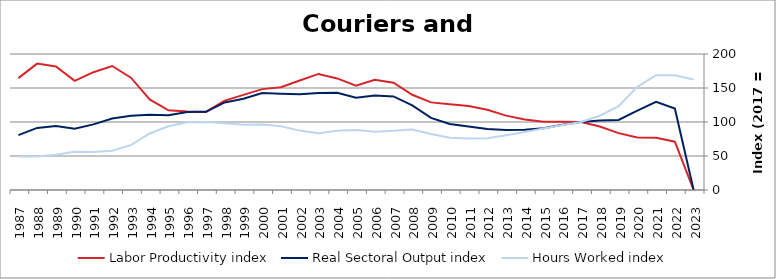
| Category | Labor Productivity index | Real Sectoral Output index | Hours Worked index |
|---|---|---|---|
| 2023.0 | 0 | 0 | 162.595 |
| 2022.0 | 70.989 | 119.69 | 168.603 |
| 2021.0 | 76.718 | 129.535 | 168.845 |
| 2020.0 | 77.069 | 116.841 | 151.606 |
| 2019.0 | 83.61 | 103.061 | 123.264 |
| 2018.0 | 93.471 | 102.101 | 109.234 |
| 2017.0 | 100 | 100 | 100 |
| 2016.0 | 100.456 | 96.055 | 95.62 |
| 2015.0 | 100.287 | 90.653 | 90.394 |
| 2014.0 | 103.815 | 88.674 | 85.415 |
| 2013.0 | 109.354 | 88.071 | 80.537 |
| 2012.0 | 117.931 | 89.651 | 76.02 |
| 2011.0 | 123.548 | 93.517 | 75.693 |
| 2010.0 | 126.144 | 97.024 | 76.916 |
| 2009.0 | 128.856 | 106.046 | 82.298 |
| 2008.0 | 140.009 | 124.462 | 88.895 |
| 2007.0 | 157.832 | 137.572 | 87.164 |
| 2006.0 | 162.185 | 138.897 | 85.641 |
| 2005.0 | 153.368 | 135.559 | 88.389 |
| 2004.0 | 164.104 | 142.894 | 87.075 |
| 2003.0 | 170.702 | 142.658 | 83.571 |
| 2002.0 | 161.011 | 140.629 | 87.341 |
| 2001.0 | 151.175 | 141.543 | 93.628 |
| 2000.0 | 148.367 | 142.721 | 96.194 |
| 1999.0 | 139.847 | 134.21 | 95.97 |
| 1998.0 | 131.39 | 128.803 | 98.031 |
| 1997.0 | 114.8 | 114.914 | 100.099 |
| 1996.0 | 115.313 | 114.824 | 99.576 |
| 1995.0 | 117.16 | 109.899 | 93.802 |
| 1994.0 | 133.201 | 110.643 | 83.065 |
| 1993.0 | 165.152 | 109.038 | 66.023 |
| 1992.0 | 182.324 | 105.183 | 57.69 |
| 1991.0 | 173.211 | 96.506 | 55.716 |
| 1990.0 | 160.474 | 90.011 | 56.091 |
| 1989.0 | 181.605 | 94.179 | 51.86 |
| 1988.0 | 185.887 | 91.35 | 49.143 |
| 1987.0 | 164.557 | 80.787 | 49.094 |